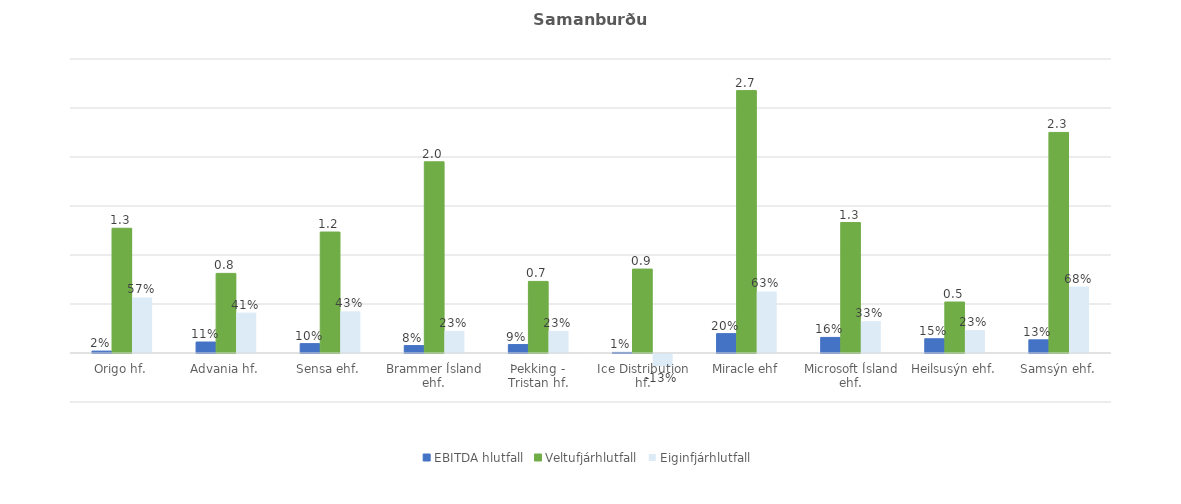
| Category | EBITDA hlutfall | Veltufjárhlutfall | Eiginfjárhlutfall |
|---|---|---|---|
| Origo hf. | 0.019 | 1.273 | 0.567 |
| Advania hf. | 0.112 | 0.812 | 0.412 |
| Sensa ehf. | 0.096 | 1.234 | 0.427 |
| Brammer Ísland ehf. | 0.076 | 1.951 | 0.226 |
| Þekking - Tristan hf. | 0.086 | 0.73 | 0.226 |
| Ice Distribution hf. | 0.006 | 0.856 | -0.126 |
| Miracle ehf | 0.197 | 2.677 | 0.628 |
| Microsoft Ísland ehf. | 0.159 | 1.331 | 0.325 |
| Heilsusýn ehf. | 0.145 | 0.52 | 0.234 |
| Samsýn ehf. | 0.134 | 2.251 | 0.678 |